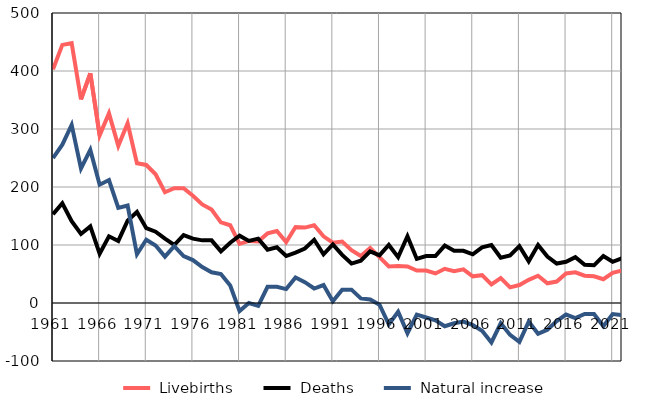
| Category |  Livebirths |  Deaths |  Natural increase |
|---|---|---|---|
| 1961.0 | 403 | 153 | 250 |
| 1962.0 | 445 | 172 | 273 |
| 1963.0 | 448 | 141 | 307 |
| 1964.0 | 351 | 119 | 232 |
| 1965.0 | 396 | 132 | 264 |
| 1966.0 | 289 | 85 | 204 |
| 1967.0 | 327 | 115 | 212 |
| 1968.0 | 271 | 107 | 164 |
| 1969.0 | 310 | 142 | 168 |
| 1970.0 | 241 | 157 | 84 |
| 1971.0 | 238 | 129 | 109 |
| 1972.0 | 222 | 123 | 99 |
| 1973.0 | 191 | 111 | 80 |
| 1974.0 | 198 | 100 | 98 |
| 1975.0 | 198 | 117 | 81 |
| 1976.0 | 185 | 111 | 74 |
| 1977.0 | 170 | 108 | 62 |
| 1978.0 | 161 | 108 | 53 |
| 1979.0 | 139 | 89 | 50 |
| 1980.0 | 134 | 104 | 30 |
| 1981.0 | 102 | 116 | -14 |
| 1982.0 | 107 | 107 | 0 |
| 1983.0 | 106 | 111 | -5 |
| 1984.0 | 120 | 92 | 28 |
| 1985.0 | 124 | 96 | 28 |
| 1986.0 | 105 | 81 | 24 |
| 1987.0 | 131 | 87 | 44 |
| 1988.0 | 130 | 94 | 36 |
| 1989.0 | 134 | 109 | 25 |
| 1990.0 | 115 | 84 | 31 |
| 1991.0 | 104 | 101 | 3 |
| 1992.0 | 106 | 83 | 23 |
| 1993.0 | 91 | 68 | 23 |
| 1994.0 | 81 | 73 | 8 |
| 1995.0 | 95 | 89 | 6 |
| 1996.0 | 79 | 82 | -3 |
| 1997.0 | 63 | 100 | -37 |
| 1998.0 | 64 | 79 | -15 |
| 1999.0 | 63 | 115 | -52 |
| 2000.0 | 56 | 76 | -20 |
| 2001.0 | 56 | 81 | -25 |
| 2002.0 | 51 | 81 | -30 |
| 2003.0 | 59 | 99 | -40 |
| 2004.0 | 55 | 90 | -35 |
| 2005.0 | 58 | 90 | -32 |
| 2006.0 | 46 | 84 | -38 |
| 2007.0 | 48 | 96 | -48 |
| 2008.0 | 32 | 100 | -68 |
| 2009.0 | 43 | 78 | -35 |
| 2010.0 | 27 | 82 | -55 |
| 2011.0 | 31 | 98 | -67 |
| 2012.0 | 40 | 72 | -32 |
| 2013.0 | 47 | 100 | -53 |
| 2014.0 | 34 | 80 | -46 |
| 2015.0 | 37 | 68 | -31 |
| 2016.0 | 51 | 71 | -20 |
| 2017.0 | 53 | 79 | -26 |
| 2018.0 | 47 | 66 | -19 |
| 2019.0 | 46 | 65 | -19 |
| 2020.0 | 41 | 81 | -40 |
| 2021.0 | 52 | 71 | -19 |
| 2022.0 | 56 | 77 | -21 |